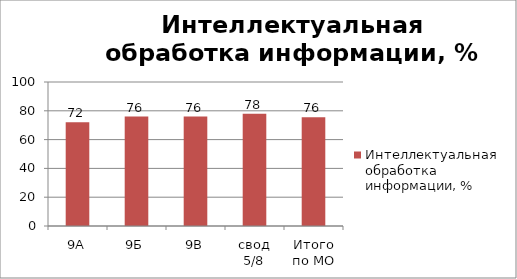
| Category | Интеллектуальная обработка информации, % |
|---|---|
| 9А | 72 |
| 9Б | 76 |
| 9В | 76 |
| свод 5/8 | 78 |
| Итого по МО | 75.5 |